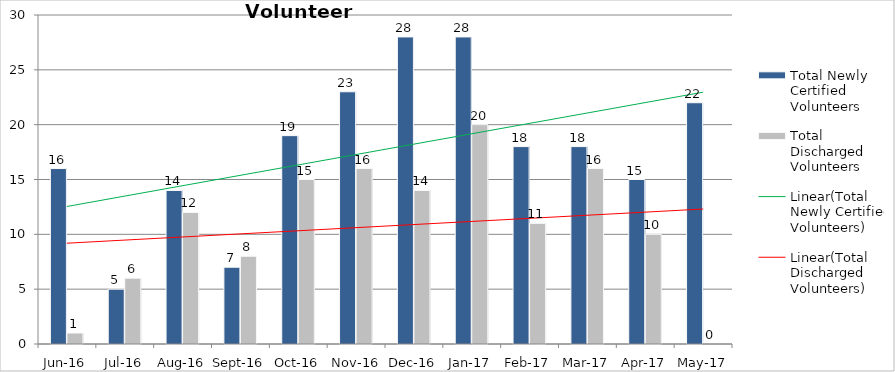
| Category | Total Newly Certified Volunteers | Total Discharged Volunteers |
|---|---|---|
| Jun-16 | 16 | 1 |
| Jul-16 | 5 | 6 |
| Aug-16 | 14 | 12 |
| Sep-16 | 7 | 8 |
| Oct-16 | 19 | 15 |
| Nov-16 | 23 | 16 |
| Dec-16 | 28 | 14 |
| Jan-17 | 28 | 20 |
| Feb-17 | 18 | 11 |
| Mar-17 | 18 | 16 |
| Apr-17 | 15 | 10 |
| May-17 | 22 | 0 |